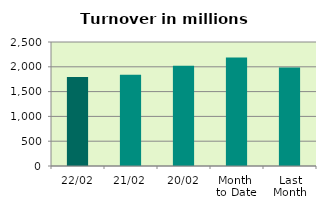
| Category | Series 0 |
|---|---|
| 22/02 | 1794.56 |
| 21/02 | 1840.414 |
| 20/02 | 2020.872 |
| Month 
to Date | 2185.716 |
| Last
Month | 1988.014 |